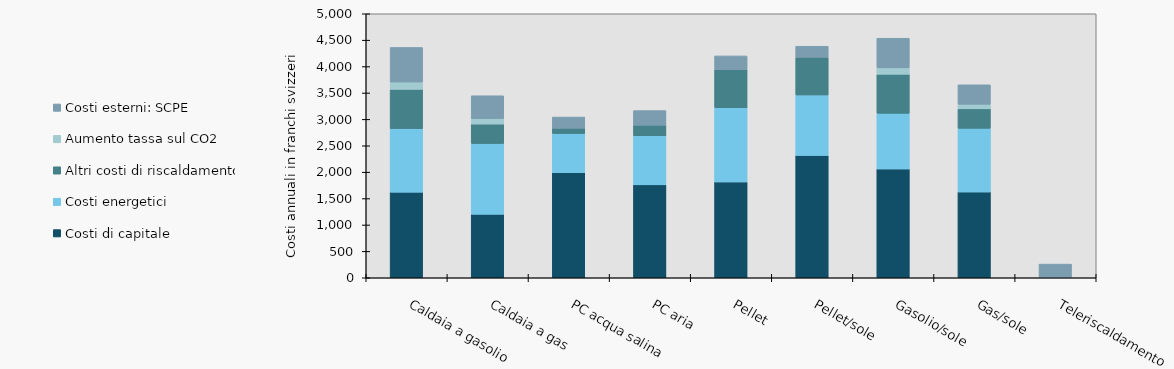
| Category | Costi di capitale | Costi energetici | Altri costi di riscaldamento | Aumento tassa sul CO2 | Costi esterni: SCPE |
|---|---|---|---|---|---|
| Caldaia a gasolio | 1621.098 | 1203.341 | 743.273 | 139.496 | 654.543 |
| Caldaia a gas | 1201.28 | 1342.513 | 367 | 104.509 | 431.998 |
| PC acqua salina | 1989.776 | 742.762 | 100 | 0 | 211.764 |
| PC aria | 1759.276 | 929.766 | 200 | 0 | 276.922 |
| Pellet | 1815.293 | 1406.156 | 717.017 | 0 | 263.414 |
| Pellet/sole | 2317.003 | 1145.925 | 711.613 | 0 | 210.731 |
| Gasolio/sole | 2061.078 | 1054.277 | 739.984 | 119.782 | 562.039 |
| Gas/sole | 1624.288 | 1207.136 | 367 | 88.833 | 367.199 |
| Teleriscaldamento | 0 | 0 | 0 | 0 | 259.199 |